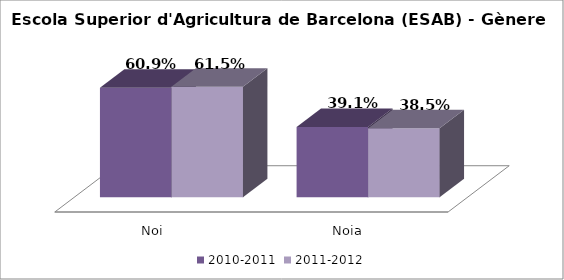
| Category | 2010-2011 | 2011-2012 |
|---|---|---|
| Noi | 0.609 | 0.615 |
| Noia | 0.391 | 0.385 |